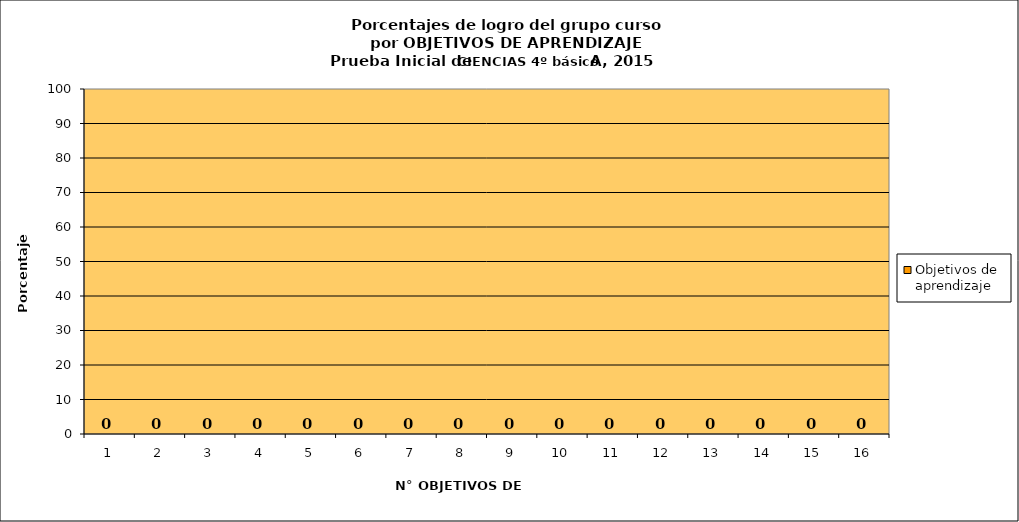
| Category | Objetivos de aprendizaje |
|---|---|
| 0 | 0 |
| 1 | 0 |
| 2 | 0 |
| 3 | 0 |
| 4 | 0 |
| 5 | 0 |
| 6 | 0 |
| 7 | 0 |
| 8 | 0 |
| 9 | 0 |
| 10 | 0 |
| 11 | 0 |
| 12 | 0 |
| 13 | 0 |
| 14 | 0 |
| 15 | 0 |